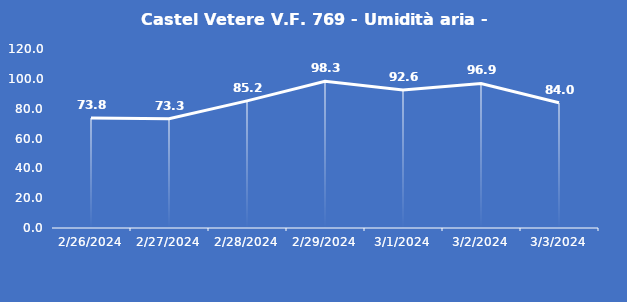
| Category | Castel Vetere V.F. 769 - Umidità aria - Grezzo (%) |
|---|---|
| 2/26/24 | 73.8 |
| 2/27/24 | 73.3 |
| 2/28/24 | 85.2 |
| 2/29/24 | 98.3 |
| 3/1/24 | 92.6 |
| 3/2/24 | 96.9 |
| 3/3/24 | 84 |